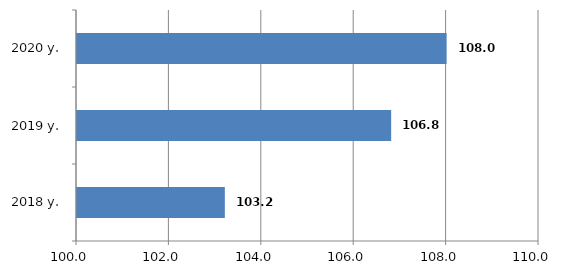
| Category | Series 0 |
|---|---|
| 2018 y. | 103.2 |
| 2019 y. | 106.8 |
| 2020 y. | 108 |